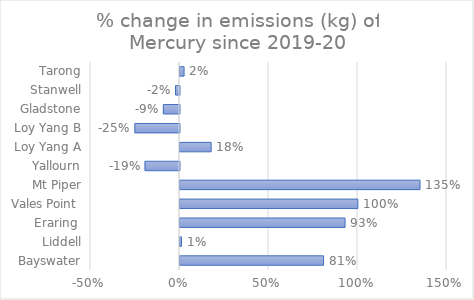
| Category | Mercury & compounds |
|---|---|
| Bayswater | 0.807 |
| Liddell | 0.009 |
|  Eraring  | 0.927 |
| Vales Point  | 0.999 |
| Mt Piper | 1.349 |
| Yallourn | -0.194 |
| Loy Yang A | 0.175 |
| Loy Yang B | -0.25 |
| Gladstone | -0.091 |
| Stanwell | -0.023 |
| Tarong | 0.023 |